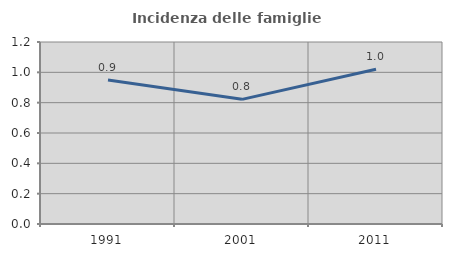
| Category | Incidenza delle famiglie numerose |
|---|---|
| 1991.0 | 0.949 |
| 2001.0 | 0.822 |
| 2011.0 | 1.02 |